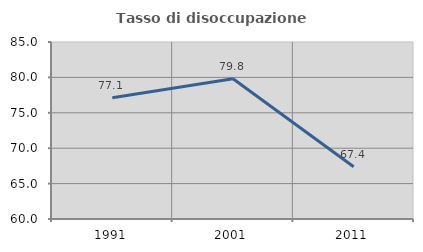
| Category | Tasso di disoccupazione giovanile  |
|---|---|
| 1991.0 | 77.113 |
| 2001.0 | 79.81 |
| 2011.0 | 67.391 |